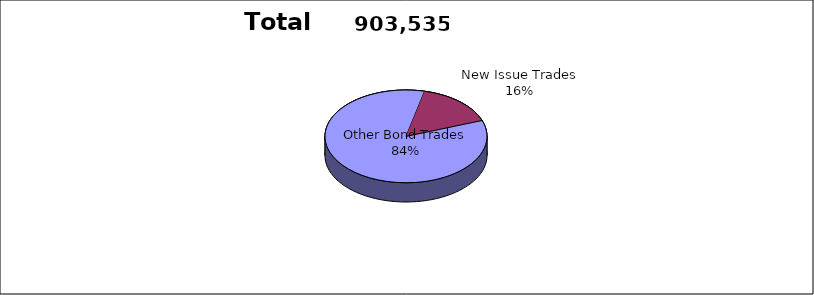
| Category | Series 0 |
|---|---|
| Other Bond Trades | 761068 |
| New Issue Trades | 142467 |